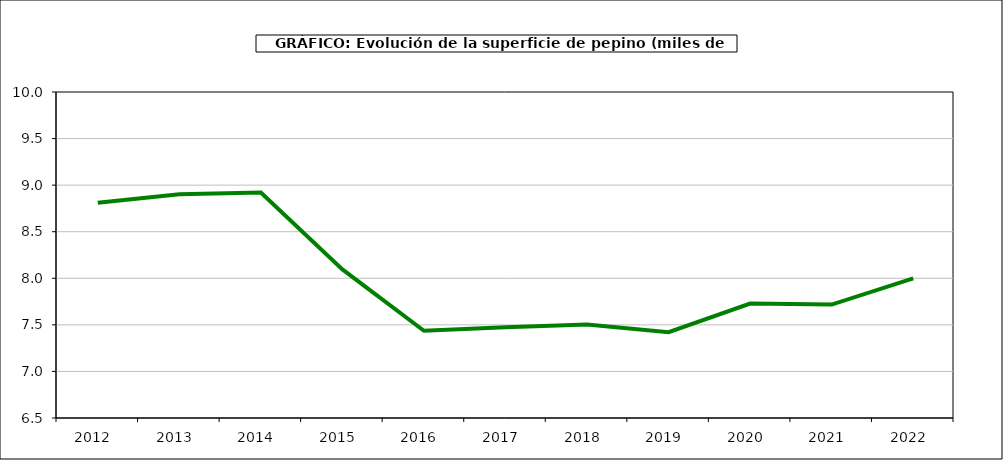
| Category | superficie |
|---|---|
| 2012.0 | 8.811 |
| 2013.0 | 8.902 |
| 2014.0 | 8.921 |
| 2015.0 | 8.095 |
| 2016.0 | 7.437 |
| 2017.0 | 7.475 |
| 2018.0 | 7.503 |
| 2019.0 | 7.422 |
| 2020.0 | 7.728 |
| 2021.0 | 7.718 |
| 2022.0 | 8 |